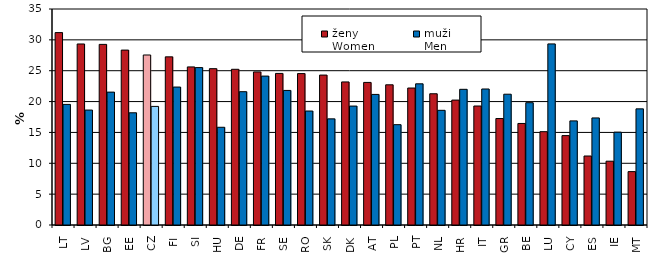
| Category | ženy
Women | muži
Men |
|---|---|---|
| LT | 31.175 | 19.541 |
| LV | 29.332 | 18.626 |
| BG | 29.266 | 21.531 |
| EE | 28.342 | 18.182 |
| CZ | 27.548 | 19.217 |
| FI | 27.247 | 22.353 |
| SI | 25.616 | 25.504 |
| HU | 25.333 | 15.836 |
| DE | 25.232 | 21.6 |
| FR | 24.805 | 24.129 |
| SE | 24.563 | 21.807 |
| RO | 24.534 | 18.47 |
| SK | 24.295 | 17.197 |
| DK | 23.183 | 19.27 |
| AT | 23.103 | 21.159 |
| PL | 22.717 | 16.258 |
| PT | 22.195 | 22.876 |
| NL | 21.265 | 18.583 |
| HR | 20.24 | 21.985 |
| IT | 19.28 | 22.039 |
| GR | 17.25 | 21.194 |
| BE | 16.452 | 19.821 |
| LU | 15.12 | 29.342 |
| CY | 14.484 | 16.872 |
| ES | 11.179 | 17.35 |
| IE | 10.339 | 15.045 |
| MT | 8.649 | 18.817 |